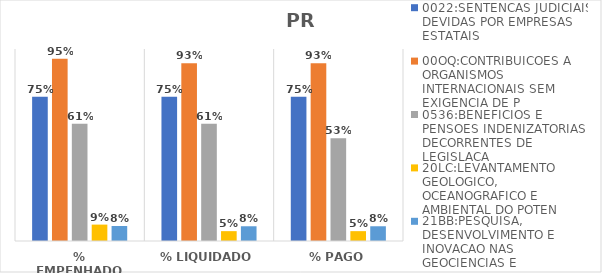
| Category | 0022:SENTENCAS JUDICIAIS DEVIDAS POR EMPRESAS ESTATAIS | 00OQ:CONTRIBUICOES A ORGANISMOS INTERNACIONAIS SEM EXIGENCIA DE P | 0536:BENEFICIOS E PENSOES INDENIZATORIAS DECORRENTES DE LEGISLACA | 20LC:LEVANTAMENTO GEOLOGICO, OCEANOGRAFICO E AMBIENTAL DO POTEN | 21BB:PESQUISA, DESENVOLVIMENTO E INOVACAO NAS GEOCIENCIAS E |
|---|---|---|---|---|---|
| % EMPENHADO | 0.751 | 0.95 | 0.611 | 0.085 | 0.078 |
| % LIQUIDADO | 0.751 | 0.926 | 0.611 | 0.051 | 0.077 |
| % PAGO | 0.751 | 0.926 | 0.535 | 0.051 | 0.077 |